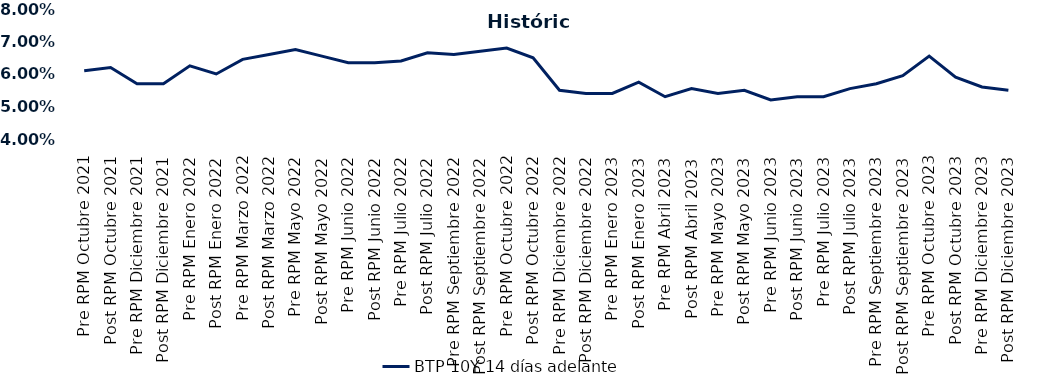
| Category | BTP 10Y 14 días adelante |
|---|---|
| Pre RPM Octubre 2021 | 0.061 |
| Post RPM Octubre 2021 | 0.062 |
| Pre RPM Diciembre 2021 | 0.057 |
| Post RPM Diciembre 2021 | 0.057 |
| Pre RPM Enero 2022 | 0.062 |
| Post RPM Enero 2022 | 0.06 |
| Pre RPM Marzo 2022 | 0.064 |
| Post RPM Marzo 2022 | 0.066 |
| Pre RPM Mayo 2022 | 0.068 |
| Post RPM Mayo 2022 | 0.066 |
| Pre RPM Junio 2022 | 0.064 |
| Post RPM Junio 2022 | 0.064 |
| Pre RPM Julio 2022 | 0.064 |
| Post RPM Julio 2022 | 0.066 |
| Pre RPM Septiembre 2022 | 0.066 |
| Post RPM Septiembre 2022 | 0.067 |
| Pre RPM Octubre 2022 | 0.068 |
| Post RPM Octubre 2022 | 0.065 |
| Pre RPM Diciembre 2022 | 0.055 |
| Post RPM Diciembre 2022 | 0.054 |
| Pre RPM Enero 2023 | 0.054 |
| Post RPM Enero 2023 | 0.058 |
| Pre RPM Abril 2023 | 0.053 |
| Post RPM Abril 2023 | 0.056 |
| Pre RPM Mayo 2023 | 0.054 |
| Post RPM Mayo 2023 | 0.055 |
| Pre RPM Junio 2023 | 0.052 |
| Post RPM Junio 2023 | 0.053 |
| Pre RPM Julio 2023 | 0.053 |
| Post RPM Julio 2023 | 0.056 |
| Pre RPM Septiembre 2023 | 0.057 |
| Post RPM Septiembre 2023 | 0.06 |
| Pre RPM Octubre 2023 | 0.066 |
| Post RPM Octubre 2023 | 0.059 |
| Pre RPM Diciembre 2023 | 0.056 |
| Post RPM Diciembre 2023 | 0.055 |